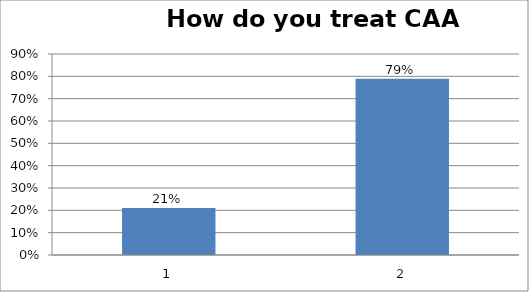
| Category | Series 0 |
|---|---|
| 0 | 0.211 |
| 1 | 0.789 |